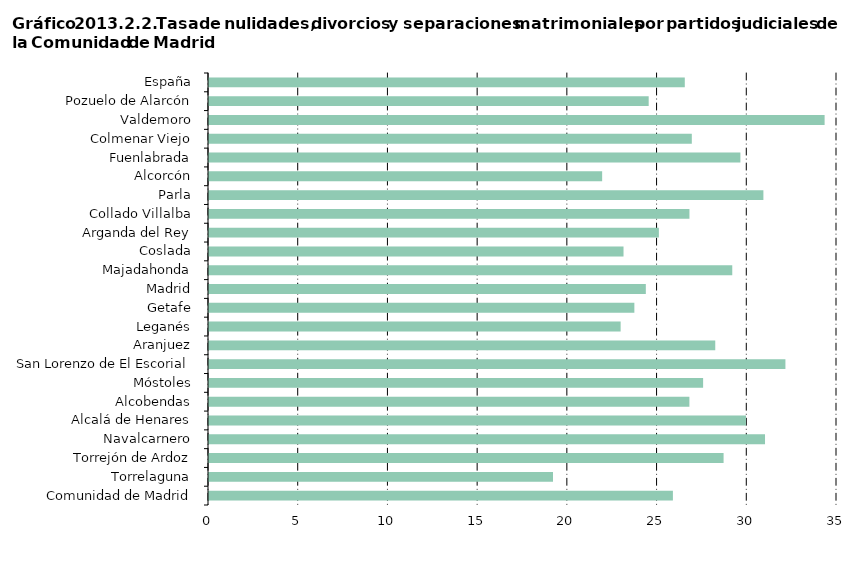
| Category | Series 0 |
|---|---|
| Comunidad de Madrid | 25.855 |
|     Torrelaguna | 19.172 |
|     Torrejón de Ardoz | 28.679 |
|     Navalcarnero | 30.988 |
|     Alcalá de Henares | 29.927 |
|     Alcobendas | 26.774 |
|     Móstoles | 27.538 |
|     San Lorenzo de El Escorial | 32.125 |
|     Aranjuez | 28.215 |
|     Leganés | 22.942 |
|     Getafe | 23.707 |
|     Madrid | 24.345 |
|     Majadahonda | 29.163 |
|     Coslada | 23.103 |
|     Arganda del Rey | 25.072 |
|     Collado Villalba | 26.776 |
|     Parla | 30.898 |
|     Alcorcón | 21.912 |
|     Fuenlabrada | 29.617 |
|     Colmenar Viejo | 26.908 |
|     Valdemoro | 34.31 |
|     Pozuelo de Alarcón | 24.505 |
| España | 26.517 |